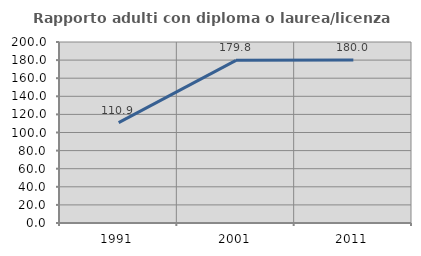
| Category | Rapporto adulti con diploma o laurea/licenza media  |
|---|---|
| 1991.0 | 110.891 |
| 2001.0 | 179.762 |
| 2011.0 | 180 |